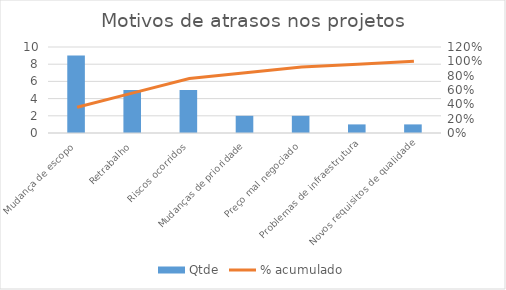
| Category | Qtde |
|---|---|
| Mudança de escopo | 9 |
| Retrabalho | 5 |
| Riscos ocorridos | 5 |
| Mudanças de prioridade | 2 |
| Preço mal negociado | 2 |
| Problemas de infraestrutura | 1 |
| Novos requisitos de qualidade | 1 |